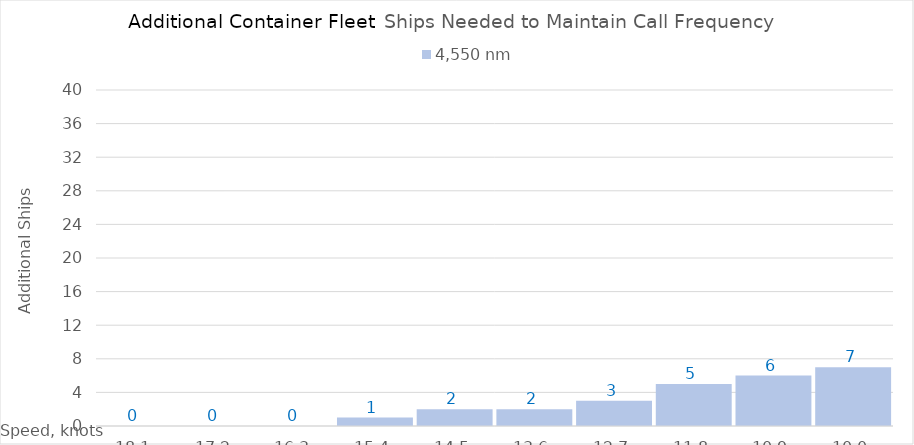
| Category | 4,550 |
|---|---|
| 18.1 | 0 |
| 17.200000000000003 | 0 |
| 16.300000000000004 | 0 |
| 15.400000000000004 | 1 |
| 14.500000000000004 | 2 |
| 13.600000000000003 | 2 |
| 12.700000000000003 | 3 |
| 11.800000000000002 | 5 |
| 10.900000000000002 | 6 |
| 10.000000000000002 | 7 |